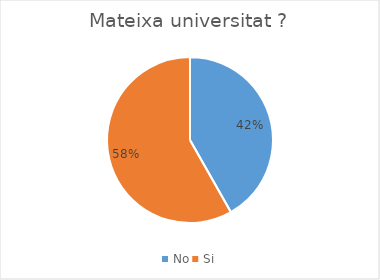
| Category | Series 0 |
|---|---|
| No | 28 |
| Si | 39 |